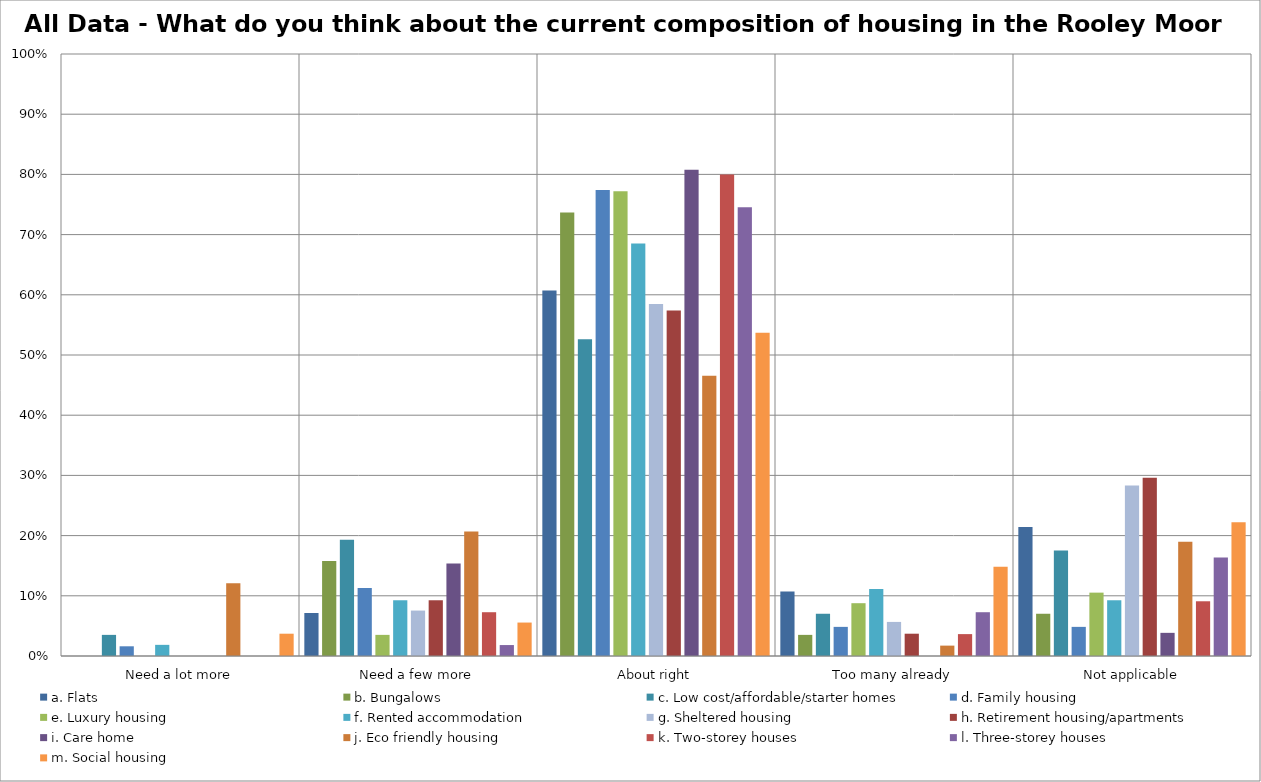
| Category | a. Flats | b. Bungalows | c. Low cost/affordable/starter homes | d. Family housing | e. Luxury housing | f. Rented accommodation | g. Sheltered housing | h. Retirement housing/apartments | i. Care home | j. Eco friendly housing | k. Two-storey houses | l. Three-storey houses | m. Social housing |
|---|---|---|---|---|---|---|---|---|---|---|---|---|---|
| Need a lot more | 0 | 0 | 0.035 | 0.016 | 0 | 0.019 | 0 | 0 | 0 | 0.121 | 0 | 0 | 0.037 |
| Need a few more | 0.071 | 0.158 | 0.193 | 0.113 | 0.035 | 0.093 | 0.075 | 0.093 | 0.154 | 0.207 | 0.073 | 0.018 | 0.056 |
| About right | 0.607 | 0.737 | 0.526 | 0.774 | 0.772 | 0.685 | 0.585 | 0.574 | 0.808 | 0.466 | 0.8 | 0.745 | 0.537 |
| Too many already | 0.107 | 0.035 | 0.07 | 0.048 | 0.088 | 0.111 | 0.057 | 0.037 | 0 | 0.017 | 0.036 | 0.073 | 0.148 |
| Not applicable | 0.214 | 0.07 | 0.175 | 0.048 | 0.105 | 0.093 | 0.283 | 0.296 | 0.038 | 0.19 | 0.091 | 0.164 | 0.222 |